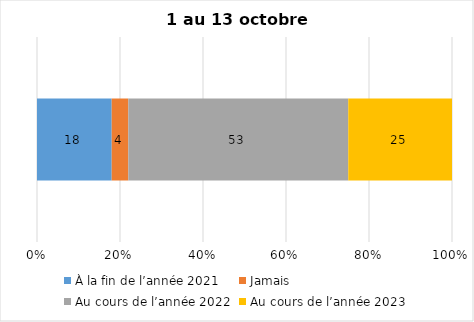
| Category | À la fin de l’année 2021 | Jamais | Au cours de l’année 2022 | Au cours de l’année 2023 |
|---|---|---|---|---|
| 0 | 18 | 4 | 53 | 25 |